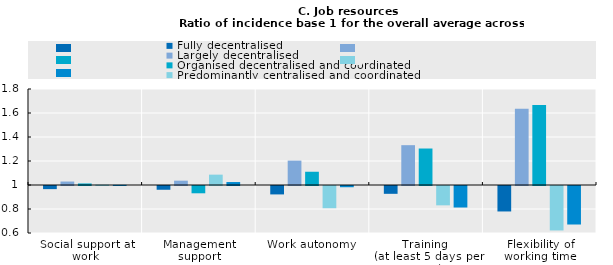
| Category | Fully decentralised | Largely decentralised | Organised decentralised and coordinated | Predominantly centralised and coordinated | Predominantly centralised and weakly co-ordinated |
|---|---|---|---|---|---|
| Social support at work | 0.974 | 1.029 | 1.013 | 1.003 | 1.001 |
| Management support | 0.969 | 1.036 | 0.939 | 1.086 | 1.025 |
| Work autonomy | 0.93 | 1.203 | 1.11 | 0.815 | 0.99 |
| Training 
(at least 5 days per year) | 0.935 | 1.332 | 1.304 | 0.839 | 0.821 |
| Flexibility of working time | 0.788 | 1.635 | 1.667 | 0.63 | 0.679 |